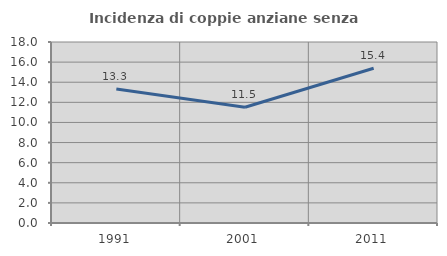
| Category | Incidenza di coppie anziane senza figli  |
|---|---|
| 1991.0 | 13.333 |
| 2001.0 | 11.515 |
| 2011.0 | 15.385 |